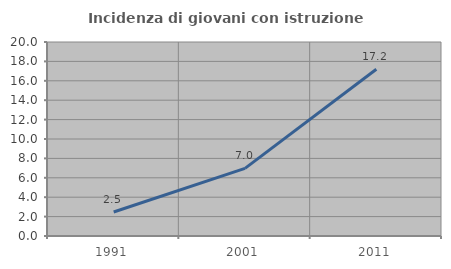
| Category | Incidenza di giovani con istruzione universitaria |
|---|---|
| 1991.0 | 2.473 |
| 2001.0 | 6.977 |
| 2011.0 | 17.193 |